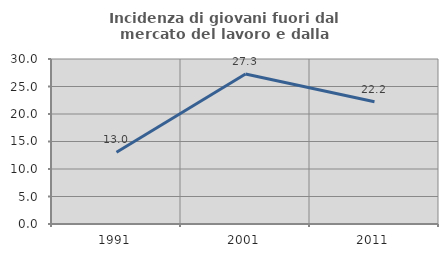
| Category | Incidenza di giovani fuori dal mercato del lavoro e dalla formazione  |
|---|---|
| 1991.0 | 13.043 |
| 2001.0 | 27.273 |
| 2011.0 | 22.222 |